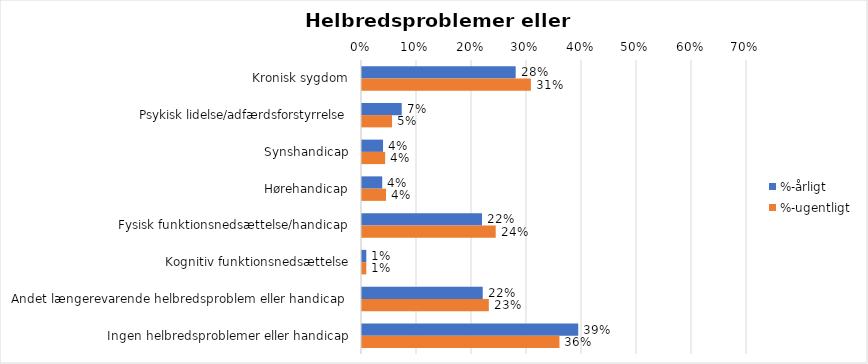
| Category | %-årligt | %-ugentligt |
|---|---|---|
| Kronisk sygdom | 0.279 | 0.307 |
| Psykisk lidelse/adfærdsforstyrrelse | 0.072 | 0.055 |
| Synshandicap | 0.038 | 0.042 |
| Hørehandicap | 0.037 | 0.044 |
| Fysisk funktionsnedsættelse/handicap | 0.218 | 0.243 |
| Kognitiv funktionsnedsættelse | 0.008 | 0.008 |
| Andet længerevarende helbredsproblem eller handicap  | 0.22 | 0.231 |
| Ingen helbredsproblemer eller handicap | 0.393 | 0.359 |